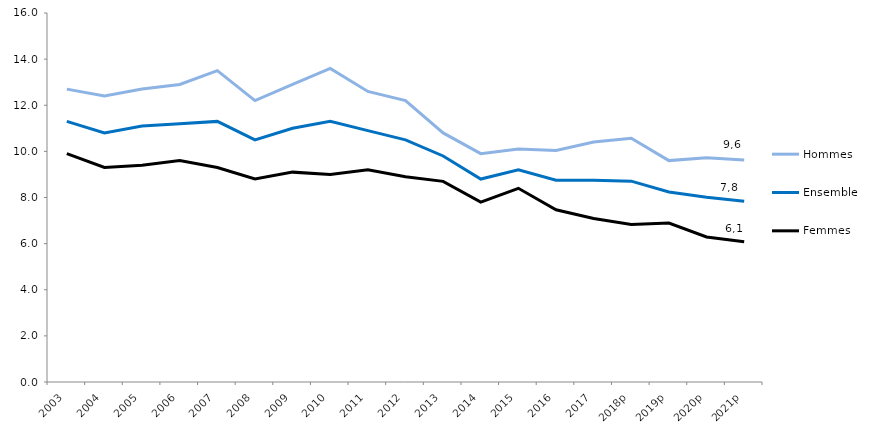
| Category | Hommes | Ensemble | Femmes  |
|---|---|---|---|
| 2003 | 12.7 | 11.3 | 9.9 |
| 2004 | 12.4 | 10.8 | 9.3 |
| 2005 | 12.7 | 11.1 | 9.4 |
| 2006 | 12.9 | 11.2 | 9.6 |
| 2007 | 13.5 | 11.3 | 9.3 |
| 2008 | 12.2 | 10.5 | 8.8 |
| 2009 | 12.9 | 11 | 9.1 |
| 2010 | 13.6 | 11.3 | 9 |
| 2011 | 12.6 | 10.9 | 9.2 |
| 2012 | 12.2 | 10.5 | 8.9 |
| 2013 | 10.8 | 9.8 | 8.7 |
| 2014 | 9.9 | 8.8 | 7.8 |
| 2015 | 10.1 | 9.2 | 8.4 |
| 2016 | 10.04 | 8.75 | 7.47 |
| 2017 | 10.41 | 8.75 | 7.09 |
| 2018p | 10.57 | 8.71 | 6.83 |
| 2019p | 9.6 | 8.24 | 6.89 |
| 2020p | 9.72 | 8.01 | 6.29 |
| 2021p | 9.63 | 7.84 | 6.08 |